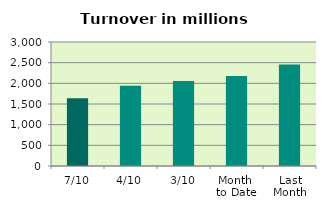
| Category | Series 0 |
|---|---|
| 7/10 | 1638.664 |
| 4/10 | 1939.107 |
| 3/10 | 2058.511 |
| Month 
to Date | 2179.127 |
| Last
Month | 2458.207 |